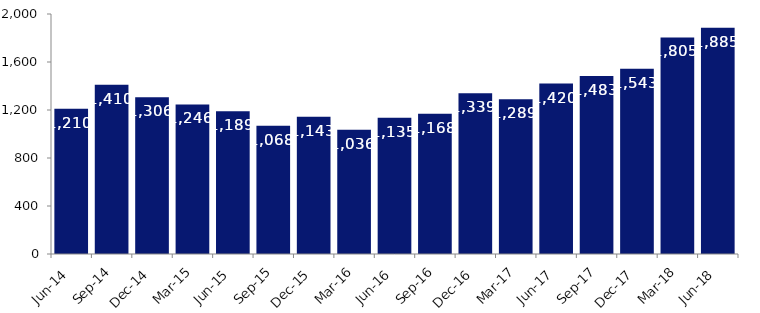
| Category | Series 0 |
|---|---|
| Jun-14 | 1210 |
| Sep-14 | 1410 |
| Dec-14 | 1306 |
| Mar-15 | 1246 |
| Jun-15 | 1189 |
| Sep-15 | 1068 |
| Dec-15 | 1143 |
| Mar-16 | 1036 |
| Jun-16 | 1135 |
| Sep-16 | 1168 |
| Dec-16 | 1339 |
| Mar-17 | 1289 |
| Jun-17 | 1420 |
| Sep-17 | 1483 |
| Dec-17 | 1543 |
| Mar-18 | 1805 |
| Jun-18 | 1885 |